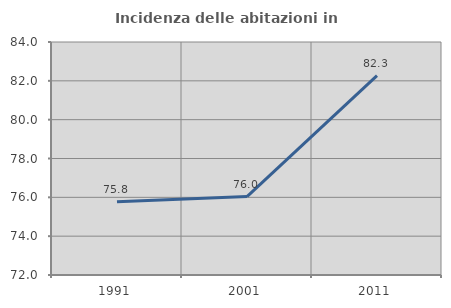
| Category | Incidenza delle abitazioni in proprietà  |
|---|---|
| 1991.0 | 75.768 |
| 2001.0 | 76.04 |
| 2011.0 | 82.267 |